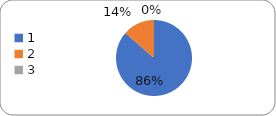
| Category | Series 0 |
|---|---|
| 0 | 89 |
| 1 | 14 |
| 2 | 0 |